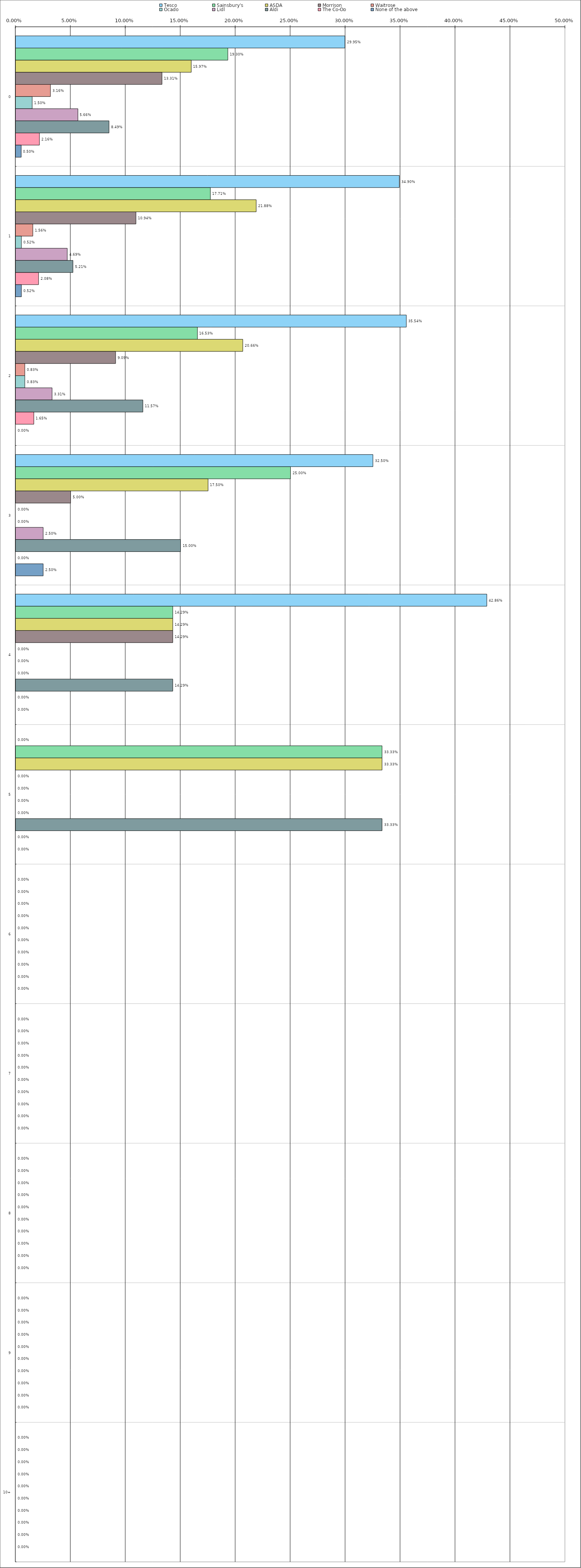
| Category | Tesco | Sainsbury's | ASDA | Morrison | Waitrose | Ocado | Lidl | Aldi | The Co-Op | None of the above |
|---|---|---|---|---|---|---|---|---|---|---|
| 0 | 0.3 | 0.193 | 0.16 | 0.133 | 0.032 | 0.015 | 0.057 | 0.085 | 0.022 | 0.005 |
| 1 | 0.349 | 0.177 | 0.219 | 0.109 | 0.016 | 0.005 | 0.047 | 0.052 | 0.021 | 0.005 |
| 2 | 0.355 | 0.165 | 0.207 | 0.091 | 0.008 | 0.008 | 0.033 | 0.116 | 0.016 | 0 |
| 3 | 0.325 | 0.25 | 0.175 | 0.05 | 0 | 0 | 0.025 | 0.15 | 0 | 0.025 |
| 4 | 0.429 | 0.143 | 0.143 | 0.143 | 0 | 0 | 0 | 0.143 | 0 | 0 |
| 5 | 0 | 0.333 | 0.333 | 0 | 0 | 0 | 0 | 0.333 | 0 | 0 |
| 6 | 0 | 0 | 0 | 0 | 0 | 0 | 0 | 0 | 0 | 0 |
| 7 | 0 | 0 | 0 | 0 | 0 | 0 | 0 | 0 | 0 | 0 |
| 8 | 0 | 0 | 0 | 0 | 0 | 0 | 0 | 0 | 0 | 0 |
| 9 | 0 | 0 | 0 | 0 | 0 | 0 | 0 | 0 | 0 | 0 |
| 10 | 0 | 0 | 0 | 0 | 0 | 0 | 0 | 0 | 0 | 0 |